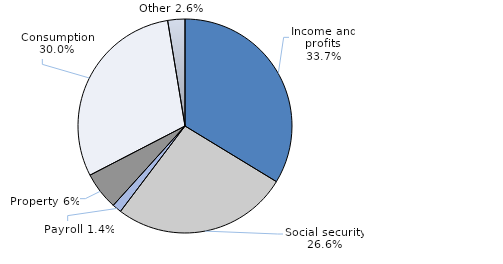
| Category | Series 0 |
|---|---|
| Income and profits | 33.7 |
| Social security | 26.6 |
| Payroll | 1.4 |
| Property | 5.7 |
| Consumption | 30 |
| Other | 2.6 |